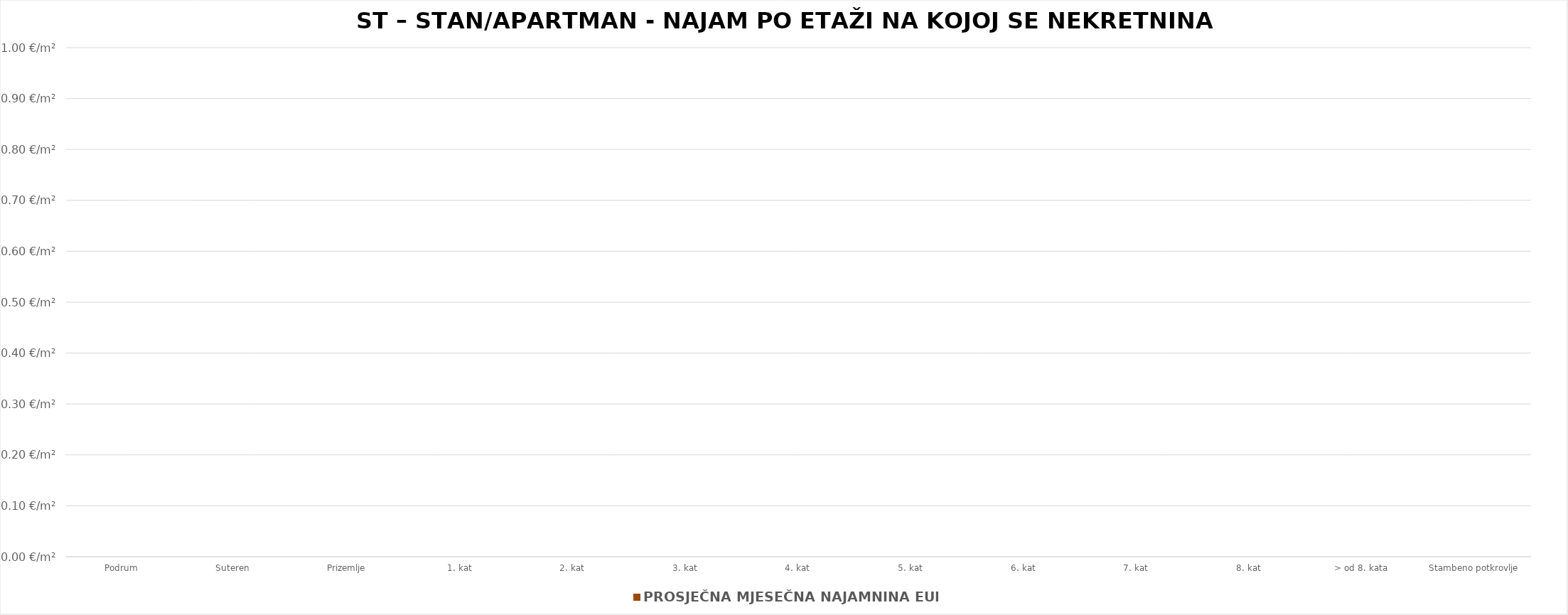
| Category | PROSJEČNA MJESEČNA NAJAMNINA EUR/m² |
|---|---|
| Podrum | 0 |
| Suteren  | 0 |
| Prizemlje | 0 |
| 1. kat | 0 |
| 2. kat | 0 |
| 3. kat | 0 |
| 4. kat | 0 |
| 5. kat | 0 |
| 6. kat | 0 |
| 7. kat | 0 |
| 8. kat | 0 |
| > od 8. kata | 0 |
| Stambeno potkrovlje | 0 |